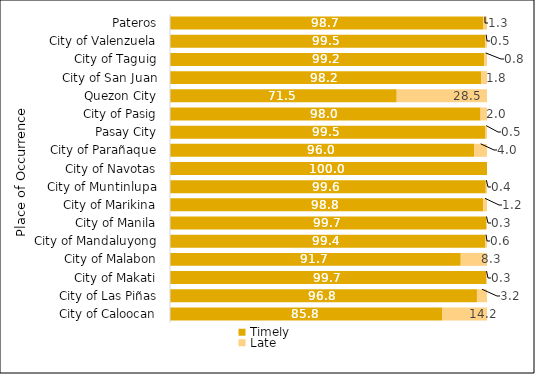
| Category | Timely | Late |
|---|---|---|
|  City of Caloocan | 85.826 | 14.174 |
|  City of Las Piñas | 96.831 | 3.169 |
|  City of Makati | 99.699 | 0.301 |
|  City of Malabon | 91.721 | 8.279 |
|  City of Mandaluyong | 99.388 | 0.612 |
|  City of Manila | 99.687 | 0.313 |
|  City of Marikina | 98.786 | 1.214 |
|  City of Muntinlupa | 99.613 | 0.387 |
|  City of Navotas | 100 | 0 |
|  City of Parañaque | 96 | 4 |
|  Pasay City | 99.526 | 0.474 |
|  City of Pasig | 97.982 | 2.018 |
|  Quezon City | 71.52 | 28.48 |
|  City of San Juan | 98.237 | 1.763 |
|  City of Taguig | 99.153 | 0.847 |
|  City of Valenzuela | 99.469 | 0.531 |
|  Pateros | 98.729 | 1.271 |